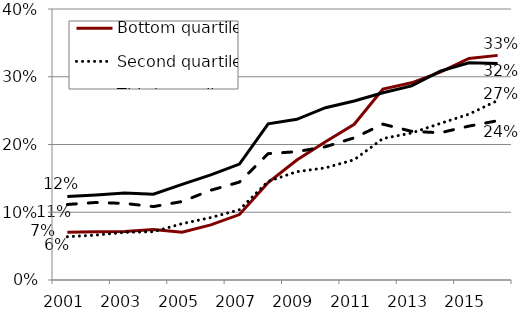
| Category | Bottom quartile | Second quartile | Third quartile | Top quartile |
|---|---|---|---|---|
| 2001.0 | 7.036 | 6.385 | 11.146 | 12.316 |
| 2002.0 | 7.115 | 6.635 | 11.447 | 12.557 |
| 2003.0 | 7.174 | 7.037 | 11.3 | 12.855 |
| 2004.0 | 7.465 | 7.127 | 10.835 | 12.653 |
| 2005.0 | 7.043 | 8.318 | 11.582 | 14.105 |
| 2006.0 | 8.135 | 9.218 | 13.245 | 15.508 |
| 2007.0 | 9.656 | 10.366 | 14.453 | 17.111 |
| 2008.0 | 14.395 | 14.571 | 18.648 | 23.053 |
| 2009.0 | 17.7 | 15.99 | 18.945 | 23.712 |
| 2010.0 | 20.419 | 16.554 | 19.674 | 25.435 |
| 2011.0 | 22.984 | 17.754 | 20.985 | 26.426 |
| 2012.0 | 28.171 | 20.877 | 23.003 | 27.63 |
| 2013.0 | 29.105 | 21.699 | 21.944 | 28.653 |
| 2014.0 | 30.696 | 23.108 | 21.731 | 30.841 |
| 2015.0 | 32.695 | 24.472 | 22.717 | 32.065 |
| 2016.0 | 33.154 | 26.502 | 23.51 | 31.943 |